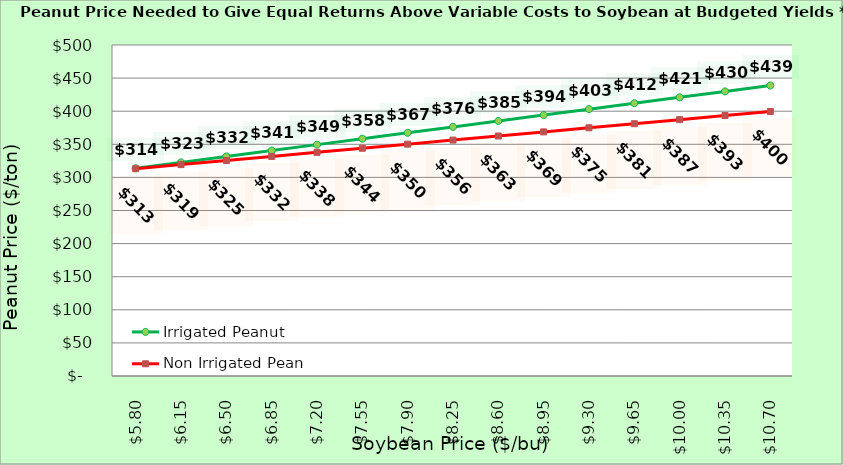
| Category | Irrigated Peanut | Non Irrigated Peanut |
|---|---|---|
| 5.8000000000000025 | 313.747 | 313.145 |
| 6.150000000000002 | 322.683 | 319.321 |
| 6.500000000000002 | 331.619 | 325.498 |
| 6.850000000000001 | 340.555 | 331.674 |
| 7.200000000000001 | 349.491 | 337.851 |
| 7.550000000000001 | 358.427 | 344.027 |
| 7.9 | 367.364 | 350.204 |
| 8.25 | 376.3 | 356.38 |
| 8.6 | 385.236 | 362.556 |
| 8.95 | 394.172 | 368.733 |
| 9.299999999999999 | 403.108 | 374.909 |
| 9.649999999999999 | 412.044 | 381.086 |
| 9.999999999999998 | 420.981 | 387.262 |
| 10.349999999999998 | 429.917 | 393.439 |
| 10.699999999999998 | 438.853 | 399.615 |